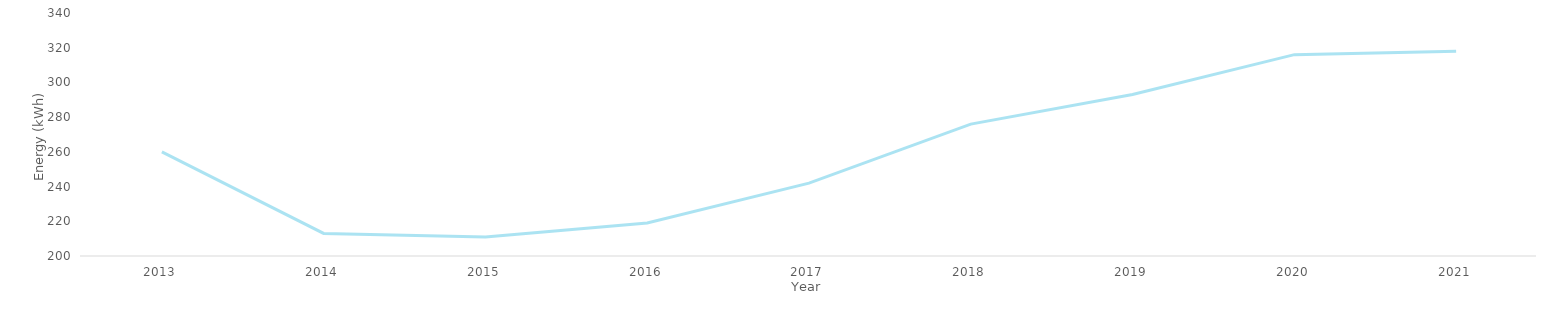
| Category | Average yearly energy consumption (kWh) |
|---|---|
| 2013.0 | 260 |
| 2014.0 | 213 |
| 2015.0 | 211 |
| 2016.0 | 219 |
| 2017.0 | 242 |
| 2018.0 | 276 |
| 2019.0 | 293 |
| 2020.0 | 316 |
| 2021.0 | 318 |